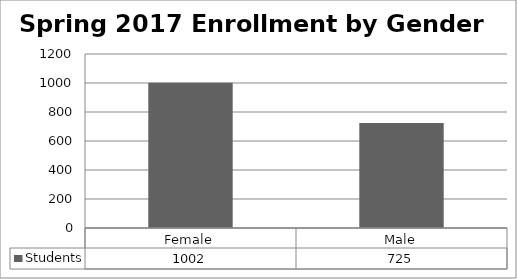
| Category | Students |
|---|---|
| Female | 1002 |
| Male | 725 |